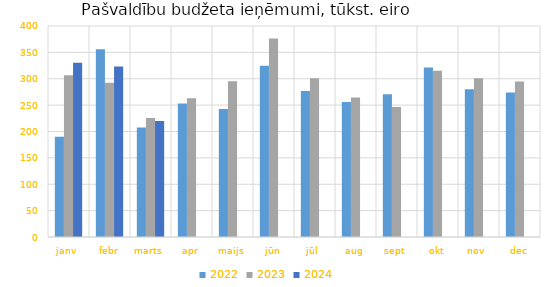
| Category | 2022 | 2023 | 2024 |
|---|---|---|---|
| janv | 190252.346 | 306465.267 | 330116.003 |
| febr | 356152.105 | 292294.044 | 323221.287 |
| marts | 207474.213 | 225671.949 | 219856.022 |
| apr | 253268.686 | 262816.149 | 0 |
| maijs | 242842.454 | 295042.686 | 0 |
| jūn | 324518.39 | 376093.33 | 0 |
| jūl | 276611.728 | 301143.927 | 0 |
| aug | 255749.732 | 264350.383 | 0 |
| sept | 270436.895 | 246209.854 | 0 |
| okt | 321133.295 | 315285.341 | 0 |
| nov | 280117.67 | 300948.206 | 0 |
| dec | 273764.648 | 294625.015 | 0 |